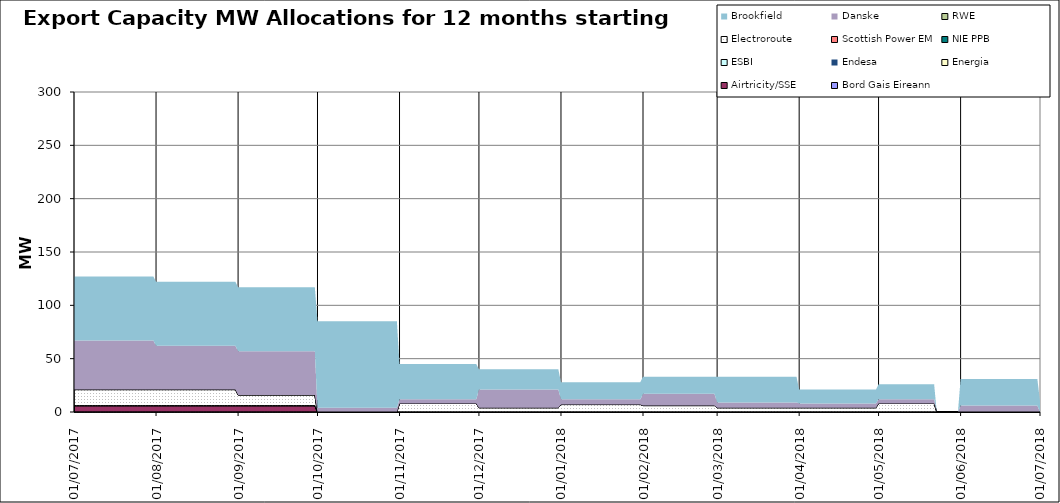
| Category | Bord Gais Eireann | Airtricity/SSE | Energia | Endesa | ESBI | NIE PPB | Scottish Power EM | Electroroute | RWE | Danske | Brookfield  |
|---|---|---|---|---|---|---|---|---|---|---|---|
| 01/07/2017 | 0 | 6 | 0 | 0 | 0 | 0 | 0 | 15 | 0 | 46 | 60 |
| 02/07/2017 | 0 | 6 | 0 | 0 | 0 | 0 | 0 | 15 | 0 | 46 | 60 |
| 03/07/2017 | 0 | 6 | 0 | 0 | 0 | 0 | 0 | 15 | 0 | 46 | 60 |
| 04/07/2017 | 0 | 6 | 0 | 0 | 0 | 0 | 0 | 15 | 0 | 46 | 60 |
| 05/07/2017 | 0 | 6 | 0 | 0 | 0 | 0 | 0 | 15 | 0 | 46 | 60 |
| 06/07/2017 | 0 | 6 | 0 | 0 | 0 | 0 | 0 | 15 | 0 | 46 | 60 |
| 07/07/2017 | 0 | 6 | 0 | 0 | 0 | 0 | 0 | 15 | 0 | 46 | 60 |
| 08/07/2017 | 0 | 6 | 0 | 0 | 0 | 0 | 0 | 15 | 0 | 46 | 60 |
| 09/07/2017 | 0 | 6 | 0 | 0 | 0 | 0 | 0 | 15 | 0 | 46 | 60 |
| 10/07/2017 | 0 | 6 | 0 | 0 | 0 | 0 | 0 | 15 | 0 | 46 | 60 |
| 11/07/2017 | 0 | 6 | 0 | 0 | 0 | 0 | 0 | 15 | 0 | 46 | 60 |
| 12/07/2017 | 0 | 6 | 0 | 0 | 0 | 0 | 0 | 15 | 0 | 46 | 60 |
| 13/07/2017 | 0 | 6 | 0 | 0 | 0 | 0 | 0 | 15 | 0 | 46 | 60 |
| 14/07/2017 | 0 | 6 | 0 | 0 | 0 | 0 | 0 | 15 | 0 | 46 | 60 |
| 15/07/2017 | 0 | 6 | 0 | 0 | 0 | 0 | 0 | 15 | 0 | 46 | 60 |
| 16/07/2017 | 0 | 6 | 0 | 0 | 0 | 0 | 0 | 15 | 0 | 46 | 60 |
| 17/07/2017 | 0 | 6 | 0 | 0 | 0 | 0 | 0 | 15 | 0 | 46 | 60 |
| 18/07/2017 | 0 | 6 | 0 | 0 | 0 | 0 | 0 | 15 | 0 | 46 | 60 |
| 19/07/2017 | 0 | 6 | 0 | 0 | 0 | 0 | 0 | 15 | 0 | 46 | 60 |
| 20/07/2017 | 0 | 6 | 0 | 0 | 0 | 0 | 0 | 15 | 0 | 46 | 60 |
| 21/07/2017 | 0 | 6 | 0 | 0 | 0 | 0 | 0 | 15 | 0 | 46 | 60 |
| 22/07/2017 | 0 | 6 | 0 | 0 | 0 | 0 | 0 | 15 | 0 | 46 | 60 |
| 23/07/2017 | 0 | 6 | 0 | 0 | 0 | 0 | 0 | 15 | 0 | 46 | 60 |
| 24/07/2017 | 0 | 6 | 0 | 0 | 0 | 0 | 0 | 15 | 0 | 46 | 60 |
| 25/07/2017 | 0 | 6 | 0 | 0 | 0 | 0 | 0 | 15 | 0 | 46 | 60 |
| 26/07/2017 | 0 | 6 | 0 | 0 | 0 | 0 | 0 | 15 | 0 | 46 | 60 |
| 27/07/2017 | 0 | 6 | 0 | 0 | 0 | 0 | 0 | 15 | 0 | 46 | 60 |
| 28/07/2017 | 0 | 6 | 0 | 0 | 0 | 0 | 0 | 15 | 0 | 46 | 60 |
| 29/07/2017 | 0 | 6 | 0 | 0 | 0 | 0 | 0 | 15 | 0 | 46 | 60 |
| 30/07/2017 | 0 | 6 | 0 | 0 | 0 | 0 | 0 | 15 | 0 | 46 | 60 |
| 31/07/2017 | 0 | 6 | 0 | 0 | 0 | 0 | 0 | 15 | 0 | 46 | 60 |
| 01/08/2017 | 0 | 6 | 0 | 0 | 0 | 0 | 0 | 15 | 0 | 41 | 60 |
| 02/08/2017 | 0 | 6 | 0 | 0 | 0 | 0 | 0 | 15 | 0 | 41 | 60 |
| 03/08/2017 | 0 | 6 | 0 | 0 | 0 | 0 | 0 | 15 | 0 | 41 | 60 |
| 04/08/2017 | 0 | 6 | 0 | 0 | 0 | 0 | 0 | 15 | 0 | 41 | 60 |
| 05/08/2017 | 0 | 6 | 0 | 0 | 0 | 0 | 0 | 15 | 0 | 41 | 60 |
| 06/08/2017 | 0 | 6 | 0 | 0 | 0 | 0 | 0 | 15 | 0 | 41 | 60 |
| 07/08/2017 | 0 | 6 | 0 | 0 | 0 | 0 | 0 | 15 | 0 | 41 | 60 |
| 08/08/2017 | 0 | 6 | 0 | 0 | 0 | 0 | 0 | 15 | 0 | 41 | 60 |
| 09/08/2017 | 0 | 6 | 0 | 0 | 0 | 0 | 0 | 15 | 0 | 41 | 60 |
| 10/08/2017 | 0 | 6 | 0 | 0 | 0 | 0 | 0 | 15 | 0 | 41 | 60 |
| 11/08/2017 | 0 | 6 | 0 | 0 | 0 | 0 | 0 | 15 | 0 | 41 | 60 |
| 12/08/2017 | 0 | 6 | 0 | 0 | 0 | 0 | 0 | 15 | 0 | 41 | 60 |
| 13/08/2017 | 0 | 6 | 0 | 0 | 0 | 0 | 0 | 15 | 0 | 41 | 60 |
| 14/08/2017 | 0 | 6 | 0 | 0 | 0 | 0 | 0 | 15 | 0 | 41 | 60 |
| 15/08/2017 | 0 | 6 | 0 | 0 | 0 | 0 | 0 | 15 | 0 | 41 | 60 |
| 16/08/2017 | 0 | 6 | 0 | 0 | 0 | 0 | 0 | 15 | 0 | 41 | 60 |
| 17/08/2017 | 0 | 6 | 0 | 0 | 0 | 0 | 0 | 15 | 0 | 41 | 60 |
| 18/08/2017 | 0 | 6 | 0 | 0 | 0 | 0 | 0 | 15 | 0 | 41 | 60 |
| 19/08/2017 | 0 | 6 | 0 | 0 | 0 | 0 | 0 | 15 | 0 | 41 | 60 |
| 20/08/2017 | 0 | 6 | 0 | 0 | 0 | 0 | 0 | 15 | 0 | 41 | 60 |
| 21/08/2017 | 0 | 6 | 0 | 0 | 0 | 0 | 0 | 15 | 0 | 41 | 60 |
| 22/08/2017 | 0 | 6 | 0 | 0 | 0 | 0 | 0 | 15 | 0 | 41 | 60 |
| 23/08/2017 | 0 | 6 | 0 | 0 | 0 | 0 | 0 | 15 | 0 | 41 | 60 |
| 24/08/2017 | 0 | 6 | 0 | 0 | 0 | 0 | 0 | 15 | 0 | 41 | 60 |
| 25/08/2017 | 0 | 6 | 0 | 0 | 0 | 0 | 0 | 15 | 0 | 41 | 60 |
| 26/08/2017 | 0 | 6 | 0 | 0 | 0 | 0 | 0 | 15 | 0 | 41 | 60 |
| 27/08/2017 | 0 | 6 | 0 | 0 | 0 | 0 | 0 | 15 | 0 | 41 | 60 |
| 28/08/2017 | 0 | 6 | 0 | 0 | 0 | 0 | 0 | 15 | 0 | 41 | 60 |
| 29/08/2017 | 0 | 6 | 0 | 0 | 0 | 0 | 0 | 15 | 0 | 41 | 60 |
| 30/08/2017 | 0 | 6 | 0 | 0 | 0 | 0 | 0 | 15 | 0 | 41 | 60 |
| 31/08/2017 | 0 | 6 | 0 | 0 | 0 | 0 | 0 | 15 | 0 | 41 | 60 |
| 01/09/2017 | 0 | 6 | 0 | 0 | 0 | 0 | 0 | 10 | 0 | 41 | 60 |
| 02/09/2017 | 0 | 6 | 0 | 0 | 0 | 0 | 0 | 10 | 0 | 41 | 60 |
| 03/09/2017 | 0 | 6 | 0 | 0 | 0 | 0 | 0 | 10 | 0 | 41 | 60 |
| 04/09/2017 | 0 | 6 | 0 | 0 | 0 | 0 | 0 | 10 | 0 | 41 | 60 |
| 05/09/2017 | 0 | 6 | 0 | 0 | 0 | 0 | 0 | 10 | 0 | 41 | 60 |
| 06/09/2017 | 0 | 6 | 0 | 0 | 0 | 0 | 0 | 10 | 0 | 41 | 60 |
| 07/09/2017 | 0 | 6 | 0 | 0 | 0 | 0 | 0 | 10 | 0 | 41 | 60 |
| 08/09/2017 | 0 | 6 | 0 | 0 | 0 | 0 | 0 | 10 | 0 | 41 | 60 |
| 09/09/2017 | 0 | 6 | 0 | 0 | 0 | 0 | 0 | 10 | 0 | 41 | 60 |
| 10/09/2017 | 0 | 6 | 0 | 0 | 0 | 0 | 0 | 10 | 0 | 41 | 60 |
| 11/09/2017 | 0 | 6 | 0 | 0 | 0 | 0 | 0 | 10 | 0 | 41 | 60 |
| 12/09/2017 | 0 | 6 | 0 | 0 | 0 | 0 | 0 | 10 | 0 | 41 | 60 |
| 13/09/2017 | 0 | 6 | 0 | 0 | 0 | 0 | 0 | 10 | 0 | 41 | 60 |
| 14/09/2017 | 0 | 6 | 0 | 0 | 0 | 0 | 0 | 10 | 0 | 41 | 60 |
| 15/09/2017 | 0 | 6 | 0 | 0 | 0 | 0 | 0 | 10 | 0 | 41 | 60 |
| 16/09/2017 | 0 | 6 | 0 | 0 | 0 | 0 | 0 | 10 | 0 | 41 | 60 |
| 17/09/2017 | 0 | 6 | 0 | 0 | 0 | 0 | 0 | 10 | 0 | 41 | 60 |
| 18/09/2017 | 0 | 6 | 0 | 0 | 0 | 0 | 0 | 10 | 0 | 41 | 60 |
| 19/09/2017 | 0 | 6 | 0 | 0 | 0 | 0 | 0 | 10 | 0 | 41 | 60 |
| 20/09/2017 | 0 | 6 | 0 | 0 | 0 | 0 | 0 | 10 | 0 | 41 | 60 |
| 21/09/2017 | 0 | 6 | 0 | 0 | 0 | 0 | 0 | 10 | 0 | 41 | 60 |
| 22/09/2017 | 0 | 6 | 0 | 0 | 0 | 0 | 0 | 10 | 0 | 41 | 60 |
| 23/09/2017 | 0 | 6 | 0 | 0 | 0 | 0 | 0 | 10 | 0 | 41 | 60 |
| 24/09/2017 | 0 | 6 | 0 | 0 | 0 | 0 | 0 | 10 | 0 | 41 | 60 |
| 25/09/2017 | 0 | 6 | 0 | 0 | 0 | 0 | 0 | 10 | 0 | 41 | 60 |
| 26/09/2017 | 0 | 6 | 0 | 0 | 0 | 0 | 0 | 10 | 0 | 41 | 60 |
| 27/09/2017 | 0 | 6 | 0 | 0 | 0 | 0 | 0 | 10 | 0 | 41 | 60 |
| 28/09/2017 | 0 | 6 | 0 | 0 | 0 | 0 | 0 | 10 | 0 | 41 | 60 |
| 29/09/2017 | 0 | 6 | 0 | 0 | 0 | 0 | 0 | 10 | 0 | 41 | 60 |
| 30/09/2017 | 0 | 6 | 0 | 0 | 0 | 0 | 0 | 10 | 0 | 41 | 60 |
| 01/10/2017 | 0 | 0 | 0 | 0 | 0 | 0 | 0 | 0 | 0 | 4 | 81 |
| 02/10/2017 | 0 | 0 | 0 | 0 | 0 | 0 | 0 | 0 | 0 | 4 | 81 |
| 03/10/2017 | 0 | 0 | 0 | 0 | 0 | 0 | 0 | 0 | 0 | 4 | 81 |
| 04/10/2017 | 0 | 0 | 0 | 0 | 0 | 0 | 0 | 0 | 0 | 4 | 81 |
| 05/10/2017 | 0 | 0 | 0 | 0 | 0 | 0 | 0 | 0 | 0 | 4 | 81 |
| 06/10/2017 | 0 | 0 | 0 | 0 | 0 | 0 | 0 | 0 | 0 | 4 | 81 |
| 07/10/2017 | 0 | 0 | 0 | 0 | 0 | 0 | 0 | 0 | 0 | 4 | 81 |
| 08/10/2017 | 0 | 0 | 0 | 0 | 0 | 0 | 0 | 0 | 0 | 4 | 81 |
| 09/10/2017 | 0 | 0 | 0 | 0 | 0 | 0 | 0 | 0 | 0 | 4 | 81 |
| 10/10/2017 | 0 | 0 | 0 | 0 | 0 | 0 | 0 | 0 | 0 | 4 | 81 |
| 11/10/2017 | 0 | 0 | 0 | 0 | 0 | 0 | 0 | 0 | 0 | 4 | 81 |
| 12/10/2017 | 0 | 0 | 0 | 0 | 0 | 0 | 0 | 0 | 0 | 4 | 81 |
| 13/10/2017 | 0 | 0 | 0 | 0 | 0 | 0 | 0 | 0 | 0 | 4 | 81 |
| 14/10/2017 | 0 | 0 | 0 | 0 | 0 | 0 | 0 | 0 | 0 | 4 | 81 |
| 15/10/2017 | 0 | 0 | 0 | 0 | 0 | 0 | 0 | 0 | 0 | 4 | 81 |
| 16/10/2017 | 0 | 0 | 0 | 0 | 0 | 0 | 0 | 0 | 0 | 4 | 81 |
| 17/10/2017 | 0 | 0 | 0 | 0 | 0 | 0 | 0 | 0 | 0 | 4 | 81 |
| 18/10/2017 | 0 | 0 | 0 | 0 | 0 | 0 | 0 | 0 | 0 | 4 | 81 |
| 19/10/2017 | 0 | 0 | 0 | 0 | 0 | 0 | 0 | 0 | 0 | 4 | 81 |
| 20/10/2017 | 0 | 0 | 0 | 0 | 0 | 0 | 0 | 0 | 0 | 4 | 81 |
| 21/10/2017 | 0 | 0 | 0 | 0 | 0 | 0 | 0 | 0 | 0 | 4 | 81 |
| 22/10/2017 | 0 | 0 | 0 | 0 | 0 | 0 | 0 | 0 | 0 | 4 | 81 |
| 23/10/2017 | 0 | 0 | 0 | 0 | 0 | 0 | 0 | 0 | 0 | 4 | 81 |
| 24/10/2017 | 0 | 0 | 0 | 0 | 0 | 0 | 0 | 0 | 0 | 4 | 81 |
| 25/10/2017 | 0 | 0 | 0 | 0 | 0 | 0 | 0 | 0 | 0 | 4 | 81 |
| 26/10/2017 | 0 | 0 | 0 | 0 | 0 | 0 | 0 | 0 | 0 | 4 | 81 |
| 27/10/2017 | 0 | 0 | 0 | 0 | 0 | 0 | 0 | 0 | 0 | 4 | 81 |
| 28/10/2017 | 0 | 0 | 0 | 0 | 0 | 0 | 0 | 0 | 0 | 4 | 81 |
| 29/10/2017 | 0 | 0 | 0 | 0 | 0 | 0 | 0 | 0 | 0 | 4 | 81 |
| 30/10/2017 | 0 | 0 | 0 | 0 | 0 | 0 | 0 | 0 | 0 | 4 | 81 |
| 31/10/2017 | 0 | 0 | 0 | 0 | 0 | 0 | 0 | 0 | 0 | 4 | 81 |
| 01/11/2017 | 0 | 0 | 0 | 0 | 0 | 0 | 0 | 8 | 0 | 4 | 33 |
| 02/11/2017 | 0 | 0 | 0 | 0 | 0 | 0 | 0 | 8 | 0 | 4 | 33 |
| 03/11/2017 | 0 | 0 | 0 | 0 | 0 | 0 | 0 | 8 | 0 | 4 | 33 |
| 04/11/2017 | 0 | 0 | 0 | 0 | 0 | 0 | 0 | 8 | 0 | 4 | 33 |
| 05/11/2017 | 0 | 0 | 0 | 0 | 0 | 0 | 0 | 8 | 0 | 4 | 33 |
| 06/11/2017 | 0 | 0 | 0 | 0 | 0 | 0 | 0 | 8 | 0 | 4 | 33 |
| 07/11/2017 | 0 | 0 | 0 | 0 | 0 | 0 | 0 | 8 | 0 | 4 | 33 |
| 08/11/2017 | 0 | 0 | 0 | 0 | 0 | 0 | 0 | 8 | 0 | 4 | 33 |
| 09/11/2017 | 0 | 0 | 0 | 0 | 0 | 0 | 0 | 8 | 0 | 4 | 33 |
| 10/11/2017 | 0 | 0 | 0 | 0 | 0 | 0 | 0 | 8 | 0 | 4 | 33 |
| 11/11/2017 | 0 | 0 | 0 | 0 | 0 | 0 | 0 | 8 | 0 | 4 | 33 |
| 12/11/2017 | 0 | 0 | 0 | 0 | 0 | 0 | 0 | 8 | 0 | 4 | 33 |
| 13/11/2017 | 0 | 0 | 0 | 0 | 0 | 0 | 0 | 8 | 0 | 4 | 33 |
| 14/11/2017 | 0 | 0 | 0 | 0 | 0 | 0 | 0 | 8 | 0 | 4 | 33 |
| 15/11/2017 | 0 | 0 | 0 | 0 | 0 | 0 | 0 | 8 | 0 | 4 | 33 |
| 16/11/2017 | 0 | 0 | 0 | 0 | 0 | 0 | 0 | 8 | 0 | 4 | 33 |
| 17/11/2017 | 0 | 0 | 0 | 0 | 0 | 0 | 0 | 8 | 0 | 4 | 33 |
| 18/11/2017 | 0 | 0 | 0 | 0 | 0 | 0 | 0 | 8 | 0 | 4 | 33 |
| 19/11/2017 | 0 | 0 | 0 | 0 | 0 | 0 | 0 | 8 | 0 | 4 | 33 |
| 20/11/2017 | 0 | 0 | 0 | 0 | 0 | 0 | 0 | 8 | 0 | 4 | 33 |
| 21/11/2017 | 0 | 0 | 0 | 0 | 0 | 0 | 0 | 8 | 0 | 4 | 33 |
| 22/11/2017 | 0 | 0 | 0 | 0 | 0 | 0 | 0 | 8 | 0 | 4 | 33 |
| 23/11/2017 | 0 | 0 | 0 | 0 | 0 | 0 | 0 | 8 | 0 | 4 | 33 |
| 24/11/2017 | 0 | 0 | 0 | 0 | 0 | 0 | 0 | 8 | 0 | 4 | 33 |
| 25/11/2017 | 0 | 0 | 0 | 0 | 0 | 0 | 0 | 8 | 0 | 4 | 33 |
| 26/11/2017 | 0 | 0 | 0 | 0 | 0 | 0 | 0 | 8 | 0 | 4 | 33 |
| 27/11/2017 | 0 | 0 | 0 | 0 | 0 | 0 | 0 | 8 | 0 | 4 | 33 |
| 28/11/2017 | 0 | 0 | 0 | 0 | 0 | 0 | 0 | 8 | 0 | 4 | 33 |
| 29/11/2017 | 0 | 0 | 0 | 0 | 0 | 0 | 0 | 8 | 0 | 4 | 33 |
| 30/11/2017 | 0 | 0 | 0 | 0 | 0 | 0 | 0 | 8 | 0 | 4 | 33 |
| 01/12/2017 | 0 | 0 | 0 | 0 | 0 | 0 | 0 | 4 | 0 | 17 | 19 |
| 02/12/2017 | 0 | 0 | 0 | 0 | 0 | 0 | 0 | 4 | 0 | 17 | 19 |
| 03/12/2017 | 0 | 0 | 0 | 0 | 0 | 0 | 0 | 4 | 0 | 17 | 19 |
| 04/12/2017 | 0 | 0 | 0 | 0 | 0 | 0 | 0 | 4 | 0 | 17 | 19 |
| 05/12/2017 | 0 | 0 | 0 | 0 | 0 | 0 | 0 | 4 | 0 | 17 | 19 |
| 06/12/2017 | 0 | 0 | 0 | 0 | 0 | 0 | 0 | 4 | 0 | 17 | 19 |
| 07/12/2017 | 0 | 0 | 0 | 0 | 0 | 0 | 0 | 4 | 0 | 17 | 19 |
| 08/12/2017 | 0 | 0 | 0 | 0 | 0 | 0 | 0 | 4 | 0 | 17 | 19 |
| 09/12/2017 | 0 | 0 | 0 | 0 | 0 | 0 | 0 | 4 | 0 | 17 | 19 |
| 10/12/2017 | 0 | 0 | 0 | 0 | 0 | 0 | 0 | 4 | 0 | 17 | 19 |
| 11/12/2017 | 0 | 0 | 0 | 0 | 0 | 0 | 0 | 4 | 0 | 17 | 19 |
| 12/12/2017 | 0 | 0 | 0 | 0 | 0 | 0 | 0 | 4 | 0 | 17 | 19 |
| 13/12/2017 | 0 | 0 | 0 | 0 | 0 | 0 | 0 | 4 | 0 | 17 | 19 |
| 14/12/2017 | 0 | 0 | 0 | 0 | 0 | 0 | 0 | 4 | 0 | 17 | 19 |
| 15/12/2017 | 0 | 0 | 0 | 0 | 0 | 0 | 0 | 4 | 0 | 17 | 19 |
| 16/12/2017 | 0 | 0 | 0 | 0 | 0 | 0 | 0 | 4 | 0 | 17 | 19 |
| 17/12/2017 | 0 | 0 | 0 | 0 | 0 | 0 | 0 | 4 | 0 | 17 | 19 |
| 18/12/2017 | 0 | 0 | 0 | 0 | 0 | 0 | 0 | 4 | 0 | 17 | 19 |
| 19/12/2017 | 0 | 0 | 0 | 0 | 0 | 0 | 0 | 4 | 0 | 17 | 19 |
| 20/12/2017 | 0 | 0 | 0 | 0 | 0 | 0 | 0 | 4 | 0 | 17 | 19 |
| 21/12/2017 | 0 | 0 | 0 | 0 | 0 | 0 | 0 | 4 | 0 | 17 | 19 |
| 22/12/2017 | 0 | 0 | 0 | 0 | 0 | 0 | 0 | 4 | 0 | 17 | 19 |
| 23/12/2017 | 0 | 0 | 0 | 0 | 0 | 0 | 0 | 4 | 0 | 17 | 19 |
| 24/12/2017 | 0 | 0 | 0 | 0 | 0 | 0 | 0 | 4 | 0 | 17 | 19 |
| 25/12/2017 | 0 | 0 | 0 | 0 | 0 | 0 | 0 | 4 | 0 | 17 | 19 |
| 26/12/2017 | 0 | 0 | 0 | 0 | 0 | 0 | 0 | 4 | 0 | 17 | 19 |
| 27/12/2017 | 0 | 0 | 0 | 0 | 0 | 0 | 0 | 4 | 0 | 17 | 19 |
| 28/12/2017 | 0 | 0 | 0 | 0 | 0 | 0 | 0 | 4 | 0 | 17 | 19 |
| 29/12/2017 | 0 | 0 | 0 | 0 | 0 | 0 | 0 | 4 | 0 | 17 | 19 |
| 30/12/2017 | 0 | 0 | 0 | 0 | 0 | 0 | 0 | 4 | 0 | 17 | 19 |
| 31/12/2017 | 0 | 0 | 0 | 0 | 0 | 0 | 0 | 4 | 0 | 17 | 19 |
| 01/01/2018 | 0 | 0 | 0 | 0 | 0 | 0 | 0 | 7 | 0 | 5 | 16 |
| 02/01/2018 | 0 | 0 | 0 | 0 | 0 | 0 | 0 | 7 | 0 | 5 | 16 |
| 03/01/2018 | 0 | 0 | 0 | 0 | 0 | 0 | 0 | 7 | 0 | 5 | 16 |
| 04/01/2018 | 0 | 0 | 0 | 0 | 0 | 0 | 0 | 7 | 0 | 5 | 16 |
| 05/01/2018 | 0 | 0 | 0 | 0 | 0 | 0 | 0 | 7 | 0 | 5 | 16 |
| 06/01/2018 | 0 | 0 | 0 | 0 | 0 | 0 | 0 | 7 | 0 | 5 | 16 |
| 07/01/2018 | 0 | 0 | 0 | 0 | 0 | 0 | 0 | 7 | 0 | 5 | 16 |
| 08/01/2018 | 0 | 0 | 0 | 0 | 0 | 0 | 0 | 7 | 0 | 5 | 16 |
| 09/01/2018 | 0 | 0 | 0 | 0 | 0 | 0 | 0 | 7 | 0 | 5 | 16 |
| 10/01/2018 | 0 | 0 | 0 | 0 | 0 | 0 | 0 | 7 | 0 | 5 | 16 |
| 11/01/2018 | 0 | 0 | 0 | 0 | 0 | 0 | 0 | 7 | 0 | 5 | 16 |
| 12/01/2018 | 0 | 0 | 0 | 0 | 0 | 0 | 0 | 7 | 0 | 5 | 16 |
| 13/01/2018 | 0 | 0 | 0 | 0 | 0 | 0 | 0 | 7 | 0 | 5 | 16 |
| 14/01/2018 | 0 | 0 | 0 | 0 | 0 | 0 | 0 | 7 | 0 | 5 | 16 |
| 15/01/2018 | 0 | 0 | 0 | 0 | 0 | 0 | 0 | 7 | 0 | 5 | 16 |
| 16/01/2018 | 0 | 0 | 0 | 0 | 0 | 0 | 0 | 7 | 0 | 5 | 16 |
| 17/01/2018 | 0 | 0 | 0 | 0 | 0 | 0 | 0 | 7 | 0 | 5 | 16 |
| 18/01/2018 | 0 | 0 | 0 | 0 | 0 | 0 | 0 | 7 | 0 | 5 | 16 |
| 19/01/2018 | 0 | 0 | 0 | 0 | 0 | 0 | 0 | 7 | 0 | 5 | 16 |
| 20/01/2018 | 0 | 0 | 0 | 0 | 0 | 0 | 0 | 7 | 0 | 5 | 16 |
| 21/01/2018 | 0 | 0 | 0 | 0 | 0 | 0 | 0 | 7 | 0 | 5 | 16 |
| 22/01/2018 | 0 | 0 | 0 | 0 | 0 | 0 | 0 | 7 | 0 | 5 | 16 |
| 23/01/2018 | 0 | 0 | 0 | 0 | 0 | 0 | 0 | 7 | 0 | 5 | 16 |
| 24/01/2018 | 0 | 0 | 0 | 0 | 0 | 0 | 0 | 7 | 0 | 5 | 16 |
| 25/01/2018 | 0 | 0 | 0 | 0 | 0 | 0 | 0 | 7 | 0 | 5 | 16 |
| 26/01/2018 | 0 | 0 | 0 | 0 | 0 | 0 | 0 | 7 | 0 | 5 | 16 |
| 27/01/2018 | 0 | 0 | 0 | 0 | 0 | 0 | 0 | 7 | 0 | 5 | 16 |
| 28/01/2018 | 0 | 0 | 0 | 0 | 0 | 0 | 0 | 7 | 0 | 5 | 16 |
| 29/01/2018 | 0 | 0 | 0 | 0 | 0 | 0 | 0 | 7 | 0 | 5 | 16 |
| 30/01/2018 | 0 | 0 | 0 | 0 | 0 | 0 | 0 | 7 | 0 | 5 | 16 |
| 31/01/2018 | 0 | 0 | 0 | 0 | 0 | 0 | 0 | 7 | 0 | 5 | 16 |
| 01/02/2018 | 0 | 0 | 0 | 0 | 0 | 0 | 0 | 6 | 0 | 11 | 16 |
| 02/02/2018 | 0 | 0 | 0 | 0 | 0 | 0 | 0 | 6 | 0 | 11 | 16 |
| 03/02/2018 | 0 | 0 | 0 | 0 | 0 | 0 | 0 | 6 | 0 | 11 | 16 |
| 04/02/2018 | 0 | 0 | 0 | 0 | 0 | 0 | 0 | 6 | 0 | 11 | 16 |
| 05/02/2018 | 0 | 0 | 0 | 0 | 0 | 0 | 0 | 6 | 0 | 11 | 16 |
| 06/02/2018 | 0 | 0 | 0 | 0 | 0 | 0 | 0 | 6 | 0 | 11 | 16 |
| 07/02/2018 | 0 | 0 | 0 | 0 | 0 | 0 | 0 | 6 | 0 | 11 | 16 |
| 08/02/2018 | 0 | 0 | 0 | 0 | 0 | 0 | 0 | 6 | 0 | 11 | 16 |
| 09/02/2018 | 0 | 0 | 0 | 0 | 0 | 0 | 0 | 6 | 0 | 11 | 16 |
| 10/02/2018 | 0 | 0 | 0 | 0 | 0 | 0 | 0 | 6 | 0 | 11 | 16 |
| 11/02/2018 | 0 | 0 | 0 | 0 | 0 | 0 | 0 | 6 | 0 | 11 | 16 |
| 12/02/2018 | 0 | 0 | 0 | 0 | 0 | 0 | 0 | 6 | 0 | 11 | 16 |
| 13/02/2018 | 0 | 0 | 0 | 0 | 0 | 0 | 0 | 6 | 0 | 11 | 16 |
| 14/02/2018 | 0 | 0 | 0 | 0 | 0 | 0 | 0 | 6 | 0 | 11 | 16 |
| 15/02/2018 | 0 | 0 | 0 | 0 | 0 | 0 | 0 | 6 | 0 | 11 | 16 |
| 16/02/2018 | 0 | 0 | 0 | 0 | 0 | 0 | 0 | 6 | 0 | 11 | 16 |
| 17/02/2018 | 0 | 0 | 0 | 0 | 0 | 0 | 0 | 6 | 0 | 11 | 16 |
| 18/02/2018 | 0 | 0 | 0 | 0 | 0 | 0 | 0 | 6 | 0 | 11 | 16 |
| 19/02/2018 | 0 | 0 | 0 | 0 | 0 | 0 | 0 | 6 | 0 | 11 | 16 |
| 20/02/2018 | 0 | 0 | 0 | 0 | 0 | 0 | 0 | 6 | 0 | 11 | 16 |
| 21/02/2018 | 0 | 0 | 0 | 0 | 0 | 0 | 0 | 6 | 0 | 11 | 16 |
| 22/02/2018 | 0 | 0 | 0 | 0 | 0 | 0 | 0 | 6 | 0 | 11 | 16 |
| 23/02/2018 | 0 | 0 | 0 | 0 | 0 | 0 | 0 | 6 | 0 | 11 | 16 |
| 24/02/2018 | 0 | 0 | 0 | 0 | 0 | 0 | 0 | 6 | 0 | 11 | 16 |
| 25/02/2018 | 0 | 0 | 0 | 0 | 0 | 0 | 0 | 6 | 0 | 11 | 16 |
| 26/02/2018 | 0 | 0 | 0 | 0 | 0 | 0 | 0 | 6 | 0 | 11 | 16 |
| 27/02/2018 | 0 | 0 | 0 | 0 | 0 | 0 | 0 | 6 | 0 | 11 | 16 |
| 28/02/2018 | 0 | 0 | 0 | 0 | 0 | 0 | 0 | 6 | 0 | 11 | 16 |
| 01/03/2018 | 0 | 0 | 0 | 0 | 0 | 0 | 0 | 4 | 0 | 5 | 24 |
| 02/03/2018 | 0 | 0 | 0 | 0 | 0 | 0 | 0 | 4 | 0 | 5 | 24 |
| 03/03/2018 | 0 | 0 | 0 | 0 | 0 | 0 | 0 | 4 | 0 | 5 | 24 |
| 04/03/2018 | 0 | 0 | 0 | 0 | 0 | 0 | 0 | 4 | 0 | 5 | 24 |
| 05/03/2018 | 0 | 0 | 0 | 0 | 0 | 0 | 0 | 4 | 0 | 5 | 24 |
| 06/03/2018 | 0 | 0 | 0 | 0 | 0 | 0 | 0 | 4 | 0 | 5 | 24 |
| 07/03/2018 | 0 | 0 | 0 | 0 | 0 | 0 | 0 | 4 | 0 | 5 | 24 |
| 08/03/2018 | 0 | 0 | 0 | 0 | 0 | 0 | 0 | 4 | 0 | 5 | 24 |
| 09/03/2018 | 0 | 0 | 0 | 0 | 0 | 0 | 0 | 4 | 0 | 5 | 24 |
| 10/03/2018 | 0 | 0 | 0 | 0 | 0 | 0 | 0 | 4 | 0 | 5 | 24 |
| 11/03/2018 | 0 | 0 | 0 | 0 | 0 | 0 | 0 | 4 | 0 | 5 | 24 |
| 12/03/2018 | 0 | 0 | 0 | 0 | 0 | 0 | 0 | 4 | 0 | 5 | 24 |
| 13/03/2018 | 0 | 0 | 0 | 0 | 0 | 0 | 0 | 4 | 0 | 5 | 24 |
| 14/03/2018 | 0 | 0 | 0 | 0 | 0 | 0 | 0 | 4 | 0 | 5 | 24 |
| 15/03/2018 | 0 | 0 | 0 | 0 | 0 | 0 | 0 | 4 | 0 | 5 | 24 |
| 16/03/2018 | 0 | 0 | 0 | 0 | 0 | 0 | 0 | 4 | 0 | 5 | 24 |
| 17/03/2018 | 0 | 0 | 0 | 0 | 0 | 0 | 0 | 4 | 0 | 5 | 24 |
| 18/03/2018 | 0 | 0 | 0 | 0 | 0 | 0 | 0 | 4 | 0 | 5 | 24 |
| 19/03/2018 | 0 | 0 | 0 | 0 | 0 | 0 | 0 | 4 | 0 | 5 | 24 |
| 20/03/2018 | 0 | 0 | 0 | 0 | 0 | 0 | 0 | 4 | 0 | 5 | 24 |
| 21/03/2018 | 0 | 0 | 0 | 0 | 0 | 0 | 0 | 4 | 0 | 5 | 24 |
| 22/03/2018 | 0 | 0 | 0 | 0 | 0 | 0 | 0 | 4 | 0 | 5 | 24 |
| 23/03/2018 | 0 | 0 | 0 | 0 | 0 | 0 | 0 | 4 | 0 | 5 | 24 |
| 24/03/2018 | 0 | 0 | 0 | 0 | 0 | 0 | 0 | 4 | 0 | 5 | 24 |
| 25/03/2018 | 0 | 0 | 0 | 0 | 0 | 0 | 0 | 4 | 0 | 5 | 24 |
| 26/03/2018 | 0 | 0 | 0 | 0 | 0 | 0 | 0 | 4 | 0 | 5 | 24 |
| 27/03/2018 | 0 | 0 | 0 | 0 | 0 | 0 | 0 | 4 | 0 | 5 | 24 |
| 28/03/2018 | 0 | 0 | 0 | 0 | 0 | 0 | 0 | 4 | 0 | 5 | 24 |
| 29/03/2018 | 0 | 0 | 0 | 0 | 0 | 0 | 0 | 4 | 0 | 5 | 24 |
| 30/03/2018 | 0 | 0 | 0 | 0 | 0 | 0 | 0 | 4 | 0 | 5 | 24 |
| 31/03/2018 | 0 | 0 | 0 | 0 | 0 | 0 | 0 | 4 | 0 | 5 | 24 |
| 01/04/2018 | 0 | 0 | 0 | 0 | 0 | 0 | 0 | 4 | 0 | 4 | 13 |
| 02/04/2018 | 0 | 0 | 0 | 0 | 0 | 0 | 0 | 4 | 0 | 4 | 13 |
| 03/04/2018 | 0 | 0 | 0 | 0 | 0 | 0 | 0 | 4 | 0 | 4 | 13 |
| 04/04/2018 | 0 | 0 | 0 | 0 | 0 | 0 | 0 | 4 | 0 | 4 | 13 |
| 05/04/2018 | 0 | 0 | 0 | 0 | 0 | 0 | 0 | 4 | 0 | 4 | 13 |
| 06/04/2018 | 0 | 0 | 0 | 0 | 0 | 0 | 0 | 4 | 0 | 4 | 13 |
| 07/04/2018 | 0 | 0 | 0 | 0 | 0 | 0 | 0 | 4 | 0 | 4 | 13 |
| 08/04/2018 | 0 | 0 | 0 | 0 | 0 | 0 | 0 | 4 | 0 | 4 | 13 |
| 09/04/2018 | 0 | 0 | 0 | 0 | 0 | 0 | 0 | 4 | 0 | 4 | 13 |
| 10/04/2018 | 0 | 0 | 0 | 0 | 0 | 0 | 0 | 4 | 0 | 4 | 13 |
| 11/04/2018 | 0 | 0 | 0 | 0 | 0 | 0 | 0 | 4 | 0 | 4 | 13 |
| 12/04/2018 | 0 | 0 | 0 | 0 | 0 | 0 | 0 | 4 | 0 | 4 | 13 |
| 13/04/2018 | 0 | 0 | 0 | 0 | 0 | 0 | 0 | 4 | 0 | 4 | 13 |
| 14/04/2018 | 0 | 0 | 0 | 0 | 0 | 0 | 0 | 4 | 0 | 4 | 13 |
| 15/04/2018 | 0 | 0 | 0 | 0 | 0 | 0 | 0 | 4 | 0 | 4 | 13 |
| 16/04/2018 | 0 | 0 | 0 | 0 | 0 | 0 | 0 | 4 | 0 | 4 | 13 |
| 17/04/2018 | 0 | 0 | 0 | 0 | 0 | 0 | 0 | 4 | 0 | 4 | 13 |
| 18/04/2018 | 0 | 0 | 0 | 0 | 0 | 0 | 0 | 4 | 0 | 4 | 13 |
| 19/04/2018 | 0 | 0 | 0 | 0 | 0 | 0 | 0 | 4 | 0 | 4 | 13 |
| 20/04/2018 | 0 | 0 | 0 | 0 | 0 | 0 | 0 | 4 | 0 | 4 | 13 |
| 21/04/2018 | 0 | 0 | 0 | 0 | 0 | 0 | 0 | 4 | 0 | 4 | 13 |
| 22/04/2018 | 0 | 0 | 0 | 0 | 0 | 0 | 0 | 4 | 0 | 4 | 13 |
| 23/04/2018 | 0 | 0 | 0 | 0 | 0 | 0 | 0 | 4 | 0 | 4 | 13 |
| 24/04/2018 | 0 | 0 | 0 | 0 | 0 | 0 | 0 | 4 | 0 | 4 | 13 |
| 25/04/2018 | 0 | 0 | 0 | 0 | 0 | 0 | 0 | 4 | 0 | 4 | 13 |
| 26/04/2018 | 0 | 0 | 0 | 0 | 0 | 0 | 0 | 4 | 0 | 4 | 13 |
| 27/04/2018 | 0 | 0 | 0 | 0 | 0 | 0 | 0 | 4 | 0 | 4 | 13 |
| 28/04/2018 | 0 | 0 | 0 | 0 | 0 | 0 | 0 | 4 | 0 | 4 | 13 |
| 29/04/2018 | 0 | 0 | 0 | 0 | 0 | 0 | 0 | 4 | 0 | 4 | 13 |
| 30/04/2018 | 0 | 0 | 0 | 0 | 0 | 0 | 0 | 4 | 0 | 4 | 13 |
| 01/05/2018 | 0 | 0 | 0 | 0 | 0 | 0 | 0 | 8 | 0 | 4 | 14 |
| 02/05/2018 | 0 | 0 | 0 | 0 | 0 | 0 | 0 | 8 | 0 | 4 | 14 |
| 03/05/2018 | 0 | 0 | 0 | 0 | 0 | 0 | 0 | 8 | 0 | 4 | 14 |
| 04/05/2018 | 0 | 0 | 0 | 0 | 0 | 0 | 0 | 8 | 0 | 4 | 14 |
| 05/05/2018 | 0 | 0 | 0 | 0 | 0 | 0 | 0 | 8 | 0 | 4 | 14 |
| 06/05/2018 | 0 | 0 | 0 | 0 | 0 | 0 | 0 | 8 | 0 | 4 | 14 |
| 07/05/2018 | 0 | 0 | 0 | 0 | 0 | 0 | 0 | 8 | 0 | 4 | 14 |
| 08/05/2018 | 0 | 0 | 0 | 0 | 0 | 0 | 0 | 8 | 0 | 4 | 14 |
| 09/05/2018 | 0 | 0 | 0 | 0 | 0 | 0 | 0 | 8 | 0 | 4 | 14 |
| 10/05/2018 | 0 | 0 | 0 | 0 | 0 | 0 | 0 | 8 | 0 | 4 | 14 |
| 11/05/2018 | 0 | 0 | 0 | 0 | 0 | 0 | 0 | 8 | 0 | 4 | 14 |
| 12/05/2018 | 0 | 0 | 0 | 0 | 0 | 0 | 0 | 8 | 0 | 4 | 14 |
| 13/05/2018 | 0 | 0 | 0 | 0 | 0 | 0 | 0 | 8 | 0 | 4 | 14 |
| 14/05/2018 | 0 | 0 | 0 | 0 | 0 | 0 | 0 | 8 | 0 | 4 | 14 |
| 15/05/2018 | 0 | 0 | 0 | 0 | 0 | 0 | 0 | 8 | 0 | 4 | 14 |
| 16/05/2018 | 0 | 0 | 0 | 0 | 0 | 0 | 0 | 8 | 0 | 4 | 14 |
| 17/05/2018 | 0 | 0 | 0 | 0 | 0 | 0 | 0 | 8 | 0 | 4 | 14 |
| 18/05/2018 | 0 | 0 | 0 | 0 | 0 | 0 | 0 | 8 | 0 | 4 | 14 |
| 19/05/2018 | 0 | 0 | 0 | 0 | 0 | 0 | 0 | 8 | 0 | 4 | 14 |
| 20/05/2018 | 0 | 0 | 0 | 0 | 0 | 0 | 0 | 8 | 0 | 4 | 14 |
| 21/05/2018 | 0 | 0 | 0 | 0 | 0 | 0 | 0 | 8 | 0 | 4 | 14 |
| 22/05/2018 | 0 | 0 | 0 | 0 | 0 | 0 | 0 | 8 | 0 | 4 | 14 |
| 23/05/2018 | 0 | 0 | 0 | 0 | 0 | 0 | 0 | 0 | 0 | 0 | 0 |
| 24/05/2018 | 0 | 0 | 0 | 0 | 0 | 0 | 0 | 0 | 0 | 0 | 0 |
| 25/05/2018 | 0 | 0 | 0 | 0 | 0 | 0 | 0 | 0 | 0 | 0 | 0 |
| 26/05/2018 | 0 | 0 | 0 | 0 | 0 | 0 | 0 | 0 | 0 | 0 | 0 |
| 27/05/2018 | 0 | 0 | 0 | 0 | 0 | 0 | 0 | 0 | 0 | 0 | 0 |
| 28/05/2018 | 0 | 0 | 0 | 0 | 0 | 0 | 0 | 0 | 0 | 0 | 0 |
| 29/05/2018 | 0 | 0 | 0 | 0 | 0 | 0 | 0 | 0 | 0 | 0 | 0 |
| 30/05/2018 | 0 | 0 | 0 | 0 | 0 | 0 | 0 | 0 | 0 | 0 | 0 |
| 31/05/2018 | 0 | 0 | 0 | 0 | 0 | 0 | 0 | 0 | 0 | 0 | 0 |
| 01/06/2018 | 0 | 0 | 0 | 0 | 0 | 0 | 0 | 0 | 0 | 6 | 25 |
| 02/06/2018 | 0 | 0 | 0 | 0 | 0 | 0 | 0 | 0 | 0 | 6 | 25 |
| 03/06/2018 | 0 | 0 | 0 | 0 | 0 | 0 | 0 | 0 | 0 | 6 | 25 |
| 04/06/2018 | 0 | 0 | 0 | 0 | 0 | 0 | 0 | 0 | 0 | 6 | 25 |
| 05/06/2018 | 0 | 0 | 0 | 0 | 0 | 0 | 0 | 0 | 0 | 6 | 25 |
| 06/06/2018 | 0 | 0 | 0 | 0 | 0 | 0 | 0 | 0 | 0 | 6 | 25 |
| 07/06/2018 | 0 | 0 | 0 | 0 | 0 | 0 | 0 | 0 | 0 | 6 | 25 |
| 08/06/2018 | 0 | 0 | 0 | 0 | 0 | 0 | 0 | 0 | 0 | 6 | 25 |
| 09/06/2018 | 0 | 0 | 0 | 0 | 0 | 0 | 0 | 0 | 0 | 6 | 25 |
| 10/06/2018 | 0 | 0 | 0 | 0 | 0 | 0 | 0 | 0 | 0 | 6 | 25 |
| 11/06/2018 | 0 | 0 | 0 | 0 | 0 | 0 | 0 | 0 | 0 | 6 | 25 |
| 12/06/2018 | 0 | 0 | 0 | 0 | 0 | 0 | 0 | 0 | 0 | 6 | 25 |
| 13/06/2018 | 0 | 0 | 0 | 0 | 0 | 0 | 0 | 0 | 0 | 6 | 25 |
| 14/06/2018 | 0 | 0 | 0 | 0 | 0 | 0 | 0 | 0 | 0 | 6 | 25 |
| 15/06/2018 | 0 | 0 | 0 | 0 | 0 | 0 | 0 | 0 | 0 | 6 | 25 |
| 16/06/2018 | 0 | 0 | 0 | 0 | 0 | 0 | 0 | 0 | 0 | 6 | 25 |
| 17/06/2018 | 0 | 0 | 0 | 0 | 0 | 0 | 0 | 0 | 0 | 6 | 25 |
| 18/06/2018 | 0 | 0 | 0 | 0 | 0 | 0 | 0 | 0 | 0 | 6 | 25 |
| 19/06/2018 | 0 | 0 | 0 | 0 | 0 | 0 | 0 | 0 | 0 | 6 | 25 |
| 20/06/2018 | 0 | 0 | 0 | 0 | 0 | 0 | 0 | 0 | 0 | 6 | 25 |
| 21/06/2018 | 0 | 0 | 0 | 0 | 0 | 0 | 0 | 0 | 0 | 6 | 25 |
| 22/06/2018 | 0 | 0 | 0 | 0 | 0 | 0 | 0 | 0 | 0 | 6 | 25 |
| 23/06/2018 | 0 | 0 | 0 | 0 | 0 | 0 | 0 | 0 | 0 | 6 | 25 |
| 24/06/2018 | 0 | 0 | 0 | 0 | 0 | 0 | 0 | 0 | 0 | 6 | 25 |
| 25/06/2018 | 0 | 0 | 0 | 0 | 0 | 0 | 0 | 0 | 0 | 6 | 25 |
| 26/06/2018 | 0 | 0 | 0 | 0 | 0 | 0 | 0 | 0 | 0 | 6 | 25 |
| 27/06/2018 | 0 | 0 | 0 | 0 | 0 | 0 | 0 | 0 | 0 | 6 | 25 |
| 28/06/2018 | 0 | 0 | 0 | 0 | 0 | 0 | 0 | 0 | 0 | 6 | 25 |
| 29/06/2018 | 0 | 0 | 0 | 0 | 0 | 0 | 0 | 0 | 0 | 6 | 25 |
| 30/06/2018 | 0 | 0 | 0 | 0 | 0 | 0 | 0 | 0 | 0 | 6 | 25 |
| 01/07/2018 | 0 | 0 | 0 | 0 | 0 | 0 | 0 | 0 | 0 | 0 | 10 |